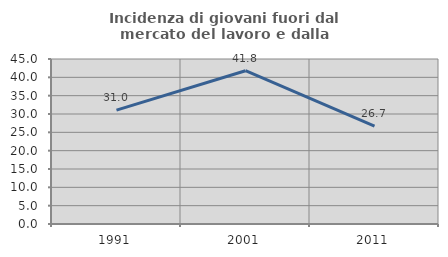
| Category | Incidenza di giovani fuori dal mercato del lavoro e dalla formazione  |
|---|---|
| 1991.0 | 31.045 |
| 2001.0 | 41.809 |
| 2011.0 | 26.683 |